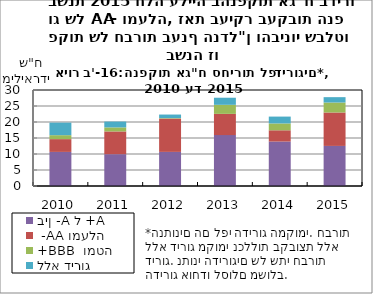
| Category | בין -A ל +A |  -AA ומעלה | +BBB  ומטה | ללא דירוג |
|---|---|---|---|---|
| 2010.0 | 10.653 | 3.995 | 1.234 | 3.918 |
| 2011.0 | 9.943 | 7.106 | 1.265 | 1.817 |
| 2012.0 | 10.658 | 10.407 | 0.15 | 1.115 |
| 2013.0 | 15.906 | 6.633 | 2.829 | 2.218 |
| 2014.0 | 13.896 | 3.512 | 2.138 | 2.145 |
| 2015.0 | 12.524 | 10.447 | 3.112 | 1.681 |